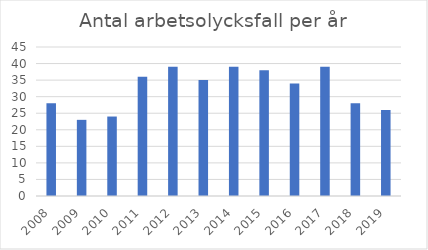
| Category | Antal arbetsolycksfall |
|---|---|
| 2008.0 | 28 |
| 2009.0 | 23 |
| 2010.0 | 24 |
| 2011.0 | 36 |
| 2012.0 | 39 |
| 2013.0 | 35 |
| 2014.0 | 39 |
| 2015.0 | 38 |
| 2016.0 | 34 |
| 2017.0 | 39 |
| 2018.0 | 28 |
| 2019.0 | 26 |